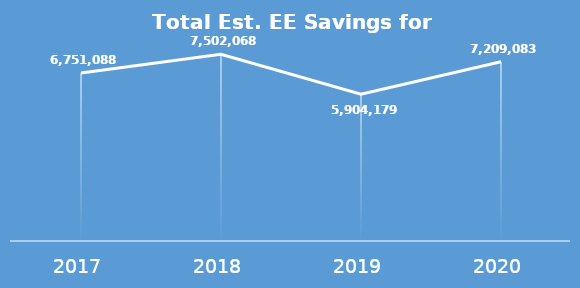
| Category | Total Est. EE Savings |
|---|---|
| 2017.0 | 6751088 |
| 2018.0 | 7502068 |
| 2019.0 | 5904179 |
| 2020.0 | 7209083 |